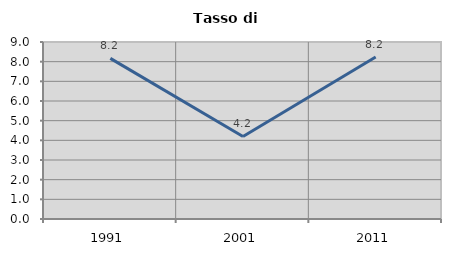
| Category | Tasso di disoccupazione   |
|---|---|
| 1991.0 | 8.168 |
| 2001.0 | 4.196 |
| 2011.0 | 8.239 |